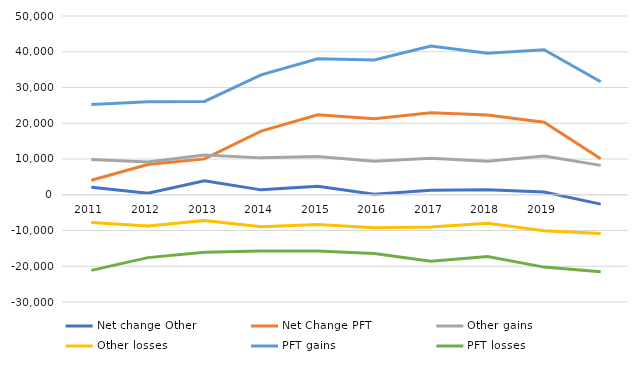
| Category | Net change Other  | Net Change PFT  | Other gains | Other losses | PFT gains | PFT losses |
|---|---|---|---|---|---|---|
| 2011.0 | 2090 | 4066 | 9861 | -7771 | 25211 | -21145 |
| 2012.0 | 419 | 8463 | 9144 | -8725 | 26048 | -17585 |
| 2013.0 | 3910 | 10032 | 11090 | -7180 | 26092 | -16060 |
| 2014.0 | 1366 | 17814 | 10315 | -8949 | 33545 | -15731 |
| 2015.0 | 2378 | 22342 | 10720 | -8342 | 38049 | -15707 |
| 2016.0 | 156 | 21237 | 9374 | -9218 | 37703 | -16466 |
| 2017.0 | 1249 | 22969 | 10242 | -8993 | 41575 | -18606 |
| 2018.0 | 1380 | 22287 | 9339 | -7959 | 39596 | -17309 |
| 2019.0 | 789 | 20311 | 10836 | -10047 | 40552 | -20241 |